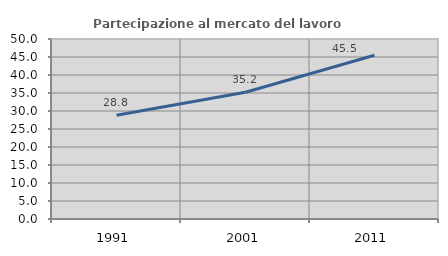
| Category | Partecipazione al mercato del lavoro  femminile |
|---|---|
| 1991.0 | 28.824 |
| 2001.0 | 35.217 |
| 2011.0 | 45.495 |